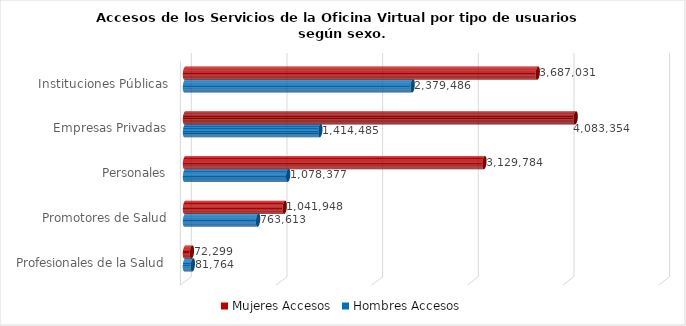
| Category | Mujeres | Hombres |
|---|---|---|
| Instituciones Públicas | 3687031 | 2379486 |
| Empresas Privadas | 4083354 | 1414485 |
| Personales | 3129784 | 1078377 |
| Promotores de Salud | 1041948 | 763613 |
| Profesionales de la Salud | 72299 | 81764 |